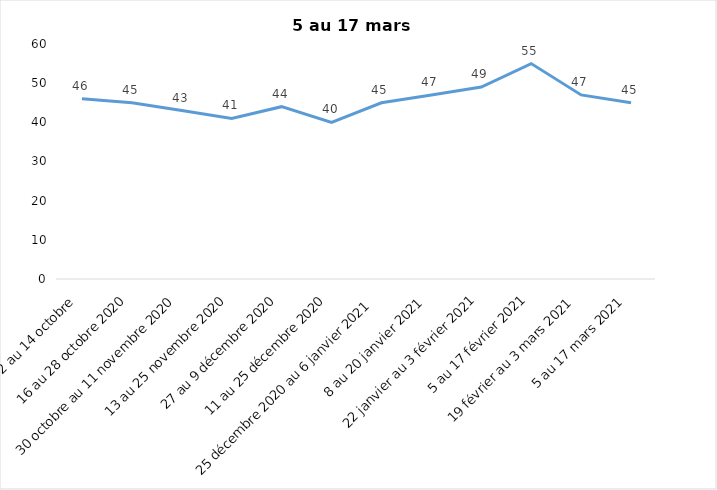
| Category | Toujours aux trois mesures |
|---|---|
| 2 au 14 octobre  | 46 |
| 16 au 28 octobre 2020 | 45 |
| 30 octobre au 11 novembre 2020 | 43 |
| 13 au 25 novembre 2020 | 41 |
| 27 au 9 décembre 2020 | 44 |
| 11 au 25 décembre 2020 | 40 |
| 25 décembre 2020 au 6 janvier 2021 | 45 |
| 8 au 20 janvier 2021 | 47 |
| 22 janvier au 3 février 2021 | 49 |
| 5 au 17 février 2021 | 55 |
| 19 février au 3 mars 2021 | 47 |
| 5 au 17 mars 2021 | 45 |